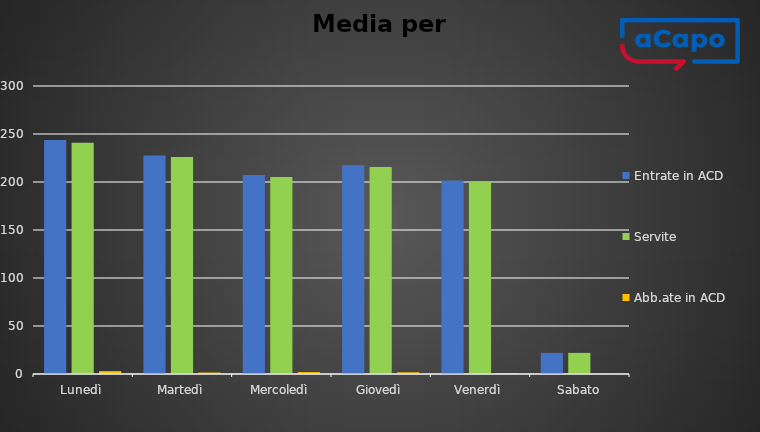
| Category | Entrate in ACD | Servite | Abb.ate in ACD |
|---|---|---|---|
| Lunedì | 243.8 | 240.8 | 3 |
| Martedì | 227.5 | 226 | 1.5 |
| Mercoledì | 207.25 | 205.25 | 2 |
| Giovedì | 217.5 | 215.75 | 1.75 |
| Venerdì | 201.5 | 200.5 | 1 |
| Sabato | 22 | 22 | 0 |